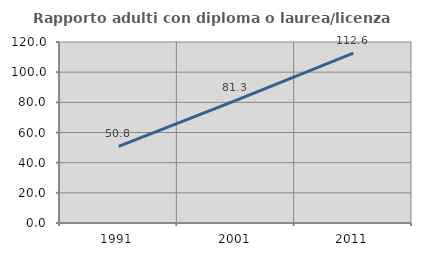
| Category | Rapporto adulti con diploma o laurea/licenza media  |
|---|---|
| 1991.0 | 50.769 |
| 2001.0 | 81.283 |
| 2011.0 | 112.587 |